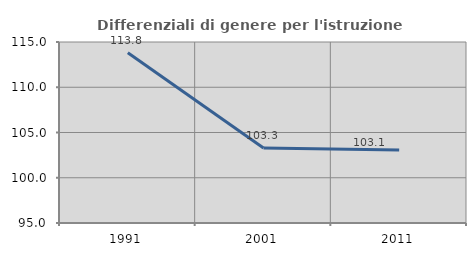
| Category | Differenziali di genere per l'istruzione superiore |
|---|---|
| 1991.0 | 113.812 |
| 2001.0 | 103.294 |
| 2011.0 | 103.079 |